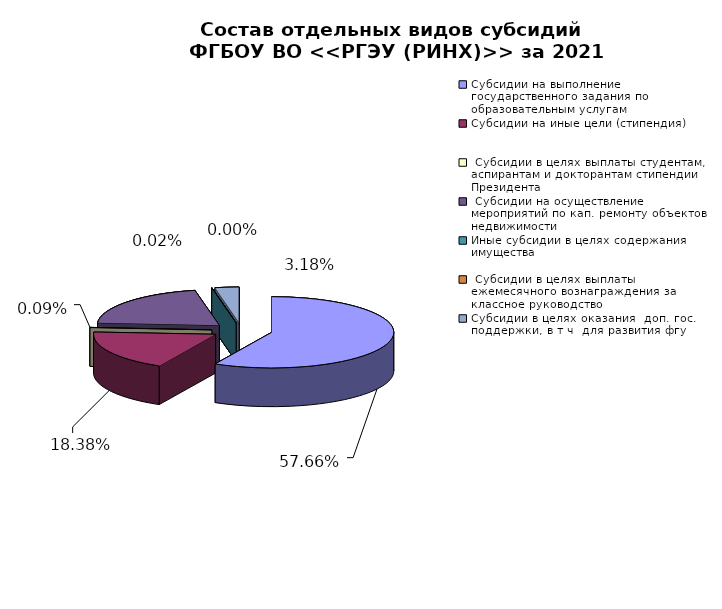
| Category | Series 0 |
|---|---|
| Субсидии на выполнение государственного задания по образовательным услугам | 0.577 |
| Субсидии на иные цели (стипендия) | 0.184 |
|  Субсидии в целях выплаты студентам, аспирантам и докторантам стипендии Президента | 0.001 |
|  Субсидии на осуществление мероприятий по кап. ремонту объектов недвижимости | 0.207 |
| Иные субсидии в целях содержания имущества | 0 |
|  Субсидии в целях выплаты ежемесячного вознаграждения за классное руководство | 0 |
| Субсидии в целях оказания  доп. гос. поддержки, в т ч  для развития фгу | 0.032 |